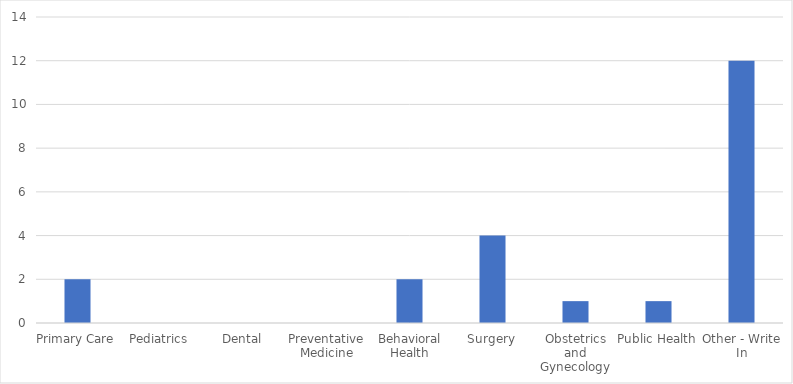
| Category | Number of Responses |
|---|---|
| Primary Care | 2 |
| Pediatrics | 0 |
| Dental | 0 |
| Preventative Medicine | 0 |
| Behavioral Health | 2 |
| Surgery | 4 |
| Obstetrics and Gynecology | 1 |
| Public Health | 1 |
| Other - Write In | 12 |